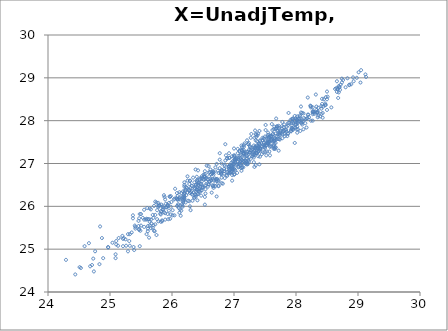
| Category | X=UnadjTemp, Y=LongTemp |
|---|---|
| 24.84 | 25.53 |
| 25.22 | 25.26 |
| 26.04 | 26.18 |
| 26.38 | 26.86 |
| 26.2 | 26.56 |
| 26.53 | 26.82 |
| 26.41 | 26.14 |
| 25.98 | 26.24 |
| 25.78 | 25.65 |
| 25.95 | 25.9 |
| 25.63 | 25.27 |
| 25.5 | 25.55 |
| 25.47 | 25.45 |
| 25.8 | 26.02 |
| 26.75 | 26.48 |
| 27.27 | 27.6 |
| 27.7 | 27.77 |
| 27.46 | 27.6 |
| 27.72 | 27.88 |
| 27.34 | 27.77 |
| 27.49 | 27.42 |
| 27.42 | 27.52 |
| 27.48 | 27.44 |
| 27.13 | 27.3 |
| 26.85 | 26.97 |
| 26.8 | 27 |
| 27.33 | 27.3 |
| 27.88 | 28.18 |
| 27.98 | 27.48 |
| 27.32 | 27.03 |
| 26.72 | 26.63 |
| 26.46 | 26.45 |
| 26.54 | 26.4 |
| 26.53 | 26.7 |
| 26.35 | 26.33 |
| 26.53 | 26.04 |
| 26.85 | 26.94 |
| 27.19 | 27 |
| 27.67 | 27.48 |
| 28.19 | 28.54 |
| 28.28 | 28.21 |
| 28.02 | 28.1 |
| 27.51 | 27.42 |
| 27.15 | 26.91 |
| 27.12 | 27.42 |
| 27.02 | 26.84 |
| 26.97 | 26.96 |
| 27.0 | 26.74 |
| 27.03 | 26.97 |
| 27.22 | 26.98 |
| 27.21 | 27.27 |
| 26.86 | 27.45 |
| 27.06 | 27.34 |
| 26.92 | 26.88 |
| 26.36 | 26.2 |
| 25.73 | 25.8 |
| 25.37 | 25.72 |
| 25.5 | 25.82 |
| 25.66 | 25.49 |
| 25.37 | 25.79 |
| 25.55 | 25.92 |
| 25.91 | 25.98 |
| 26.38 | 26.46 |
| 26.67 | 26.82 |
| 26.66 | 26.64 |
| 26.55 | 26.49 |
| 26.3 | 25.91 |
| 25.6 | 25.96 |
| 25.61 | 25.42 |
| 24.66 | 25.14 |
| 24.29 | 24.75 |
| 24.59 | 25.07 |
| 25.29 | 25.35 |
| 26.01 | 25.79 |
| 26.64 | 26.32 |
| 26.98 | 26.99 |
| 27.23 | 27.28 |
| 26.98 | 26.85 |
| 26.37 | 26.28 |
| 25.9 | 26.06 |
| 25.89 | 25.84 |
| 25.83 | 26.04 |
| 25.64 | 25.64 |
| 25.71 | 26.01 |
| 26.1 | 26.02 |
| 26.59 | 26.52 |
| 27.64 | 27.34 |
| 28.34 | 28.19 |
| 28.57 | 28.31 |
| 28.27 | 28.22 |
| 28.1 | 27.91 |
| 27.74 | 27.66 |
| 27.53 | 27.28 |
| 27.48 | 27.48 |
| 27.79 | 27.74 |
| 28.07 | 27.76 |
| 28.36 | 28.12 |
| 28.41 | 28.16 |
| 28.33 | 28.25 |
| 28.35 | 28.08 |
| 28.34 | 28.19 |
| 28.04 | 27.99 |
| 27.47 | 27.26 |
| 26.89 | 27.12 |
| 26.49 | 26.44 |
| 26.6 | 26.7 |
| 26.89 | 26.71 |
| 26.77 | 26.89 |
| 27.13 | 27.01 |
| 27.25 | 27.26 |
| 27.55 | 27.52 |
| 27.93 | 28.04 |
| 27.8 | 27.85 |
| 27.34 | 27.36 |
| 26.56 | 26.95 |
| 26.32 | 26.47 |
| 26.17 | 26.22 |
| 26.42 | 26.84 |
| 26.32 | 26.48 |
| 26.43 | 26.54 |
| 26.25 | 26.6 |
| 26.28 | 26.52 |
| 26.97 | 27.17 |
| 27.51 | 27.78 |
| 27.61 | 27.92 |
| 27.24 | 27.48 |
| 27.06 | 26.98 |
| 26.84 | 26.87 |
| 26.59 | 26.79 |
| 26.34 | 26.67 |
| 26.33 | 26.27 |
| 26.4 | 26.6 |
| 26.37 | 26.43 |
| 26.61 | 26.8 |
| 27.0 | 27.16 |
| 27.51 | 27.9 |
| 27.85 | 27.86 |
| 27.84 | 27.79 |
| 27.13 | 26.9 |
| 26.41 | 26.62 |
| 25.96 | 26.23 |
| 25.93 | 26.02 |
| 26.2 | 26.46 |
| 26.2 | 26.3 |
| 26.12 | 26.33 |
| 26.29 | 26.6 |
| 26.8 | 26.85 |
| 27.23 | 27.45 |
| 27.23 | 27.45 |
| 27.17 | 27.47 |
| 26.92 | 26.92 |
| 26.51 | 26.74 |
| 26.07 | 26.19 |
| 26.05 | 26.41 |
| 25.88 | 26.22 |
| 25.75 | 26.09 |
| 25.87 | 26.26 |
| 26.39 | 26.5 |
| 27.31 | 27.2 |
| 27.87 | 27.71 |
| 27.7 | 27.86 |
| 27.68 | 27.81 |
| 27.89 | 27.95 |
| 27.62 | 27.78 |
| 27.45 | 27.4 |
| 27.55 | 27.57 |
| 27.6 | 27.4 |
| 27.7 | 27.63 |
| 27.42 | 27.33 |
| 27.27 | 27.31 |
| 27.11 | 27.1 |
| 27.06 | 27.24 |
| 26.93 | 27.13 |
| 26.65 | 26.81 |
| 26.41 | 26.58 |
| 25.73 | 26.11 |
| 25.48 | 25.82 |
| 25.53 | 25.73 |
| 25.4 | 25.55 |
| 25.41 | 25.52 |
| 25.78 | 26.01 |
| 26.37 | 26.41 |
| 27.13 | 26.92 |
| 27.62 | 27.68 |
| 28.07 | 28.05 |
| 28.19 | 28.14 |
| 28.01 | 28.03 |
| 28.06 | 28.12 |
| 28.02 | 28.01 |
| 28.24 | 28.34 |
| 28.28 | 28.2 |
| 28.05 | 28.04 |
| 27.74 | 27.71 |
| 27.66 | 27.59 |
| 28.21 | 28.08 |
| 28.24 | 28.31 |
| 27.67 | 27.81 |
| 27.77 | 27.82 |
| 27.41 | 27.45 |
| 26.65 | 26.77 |
| 26.48 | 26.7 |
| 26.4 | 26.69 |
| 26.41 | 26.28 |
| 26.2 | 26.32 |
| 26.17 | 26.02 |
| 26.36 | 26.2 |
| 26.67 | 26.79 |
| 26.92 | 27.24 |
| 27.5 | 27.63 |
| 27.61 | 27.56 |
| 27.16 | 27.12 |
| 26.6 | 26.57 |
| 26.09 | 26.17 |
| 26.18 | 26.35 |
| 26.25 | 26.32 |
| 26.09 | 26.24 |
| 25.78 | 25.98 |
| 25.79 | 26.02 |
| 26.38 | 26.5 |
| 27.09 | 27.3 |
| 27.16 | 27.43 |
| 27.69 | 27.87 |
| 27.6 | 27.54 |
| 27.11 | 27.2 |
| 26.89 | 26.8 |
| 26.98 | 27.05 |
| 27.37 | 27.42 |
| 27.42 | 27.35 |
| 27.55 | 27.48 |
| 27.95 | 27.79 |
| 28.02 | 27.86 |
| 28.39 | 28.1 |
| 28.5 | 28.25 |
| 28.0 | 27.95 |
| 27.3 | 27.32 |
| 27.16 | 27.39 |
| 27.33 | 27.22 |
| 27.5 | 27.39 |
| 27.35 | 27.4 |
| 27.31 | 27.27 |
| 27.07 | 27.13 |
| 27.04 | 27.12 |
| 27.37 | 27.52 |
| 27.96 | 27.95 |
| 27.77 | 27.87 |
| 27.13 | 27.38 |
| 26.47 | 26.25 |
| 25.86 | 25.92 |
| 25.86 | 25.97 |
| 25.78 | 26.08 |
| 25.82 | 25.81 |
| 25.47 | 25.47 |
| 25.1 | 25.11 |
| 25.41 | 25.48 |
| 26.11 | 25.96 |
| 26.79 | 26.8 |
| 27.06 | 27.04 |
| 26.7 | 26.91 |
| 26.29 | 26.59 |
| 25.97 | 26.22 |
| 25.93 | 26 |
| 25.64 | 25.95 |
| 25.69 | 25.8 |
| 25.55 | 25.69 |
| 25.85 | 26 |
| 26.43 | 26.55 |
| 27.22 | 27 |
| 27.94 | 27.98 |
| 28.27 | 28.19 |
| 28.23 | 28.35 |
| 28.18 | 28.06 |
| 28.1 | 28.18 |
| 28.09 | 27.94 |
| 28.45 | 28.5 |
| 28.68 | 28.53 |
| 28.8 | 28.78 |
| 28.43 | 28.18 |
| 27.99 | 27.84 |
| 27.72 | 27.83 |
| 27.39 | 27.7 |
| 27.13 | 27.3 |
| 26.74 | 26.83 |
| 25.95 | 26.08 |
| 25.46 | 25.66 |
| 25.32 | 25.35 |
| 25.04 | 25.15 |
| 24.51 | 24.58 |
| 24.44 | 24.41 |
| 24.53 | 24.56 |
| 25.14 | 25.26 |
| 25.93 | 25.82 |
| 26.65 | 26.77 |
| 26.86 | 27.07 |
| 26.72 | 26.99 |
| 26.48 | 26.58 |
| 26.36 | 26.56 |
| 26.22 | 26.4 |
| 25.91 | 25.98 |
| 25.63 | 25.7 |
| 25.7 | 25.73 |
| 26.19 | 26.21 |
| 26.24 | 26.43 |
| 26.46 | 26.66 |
| 27.01 | 27.18 |
| 26.97 | 26.87 |
| 26.3 | 26.43 |
| 25.98 | 25.99 |
| 25.47 | 25.72 |
| 25.2 | 25.31 |
| 24.87 | 25.26 |
| 25.1 | 25.19 |
| 24.76 | 24.95 |
| 24.73 | 24.78 |
| 25.59 | 25.71 |
| 26.61 | 26.58 |
| 27.0 | 27.35 |
| 27.28 | 27.37 |
| 27.35 | 27.69 |
| 27.26 | 27.38 |
| 27.09 | 27.18 |
| 27.12 | 27.32 |
| 27.48 | 27.59 |
| 27.42 | 27.54 |
| 27.16 | 27.23 |
| 27.32 | 27.42 |
| 27.16 | 27.31 |
| 27.58 | 27.65 |
| 27.61 | 27.52 |
| 27.96 | 27.84 |
| 27.95 | 28.05 |
| 27.55 | 27.67 |
| 26.92 | 27.13 |
| 27.2 | 27.19 |
| 27.36 | 27.62 |
| 27.28 | 27.69 |
| 27.36 | 27.67 |
| 27.32 | 27.3 |
| 27.17 | 27.27 |
| 27.24 | 27.32 |
| 27.26 | 27.4 |
| 27.35 | 27.37 |
| 27.16 | 27.23 |
| 26.8 | 26.75 |
| 26.23 | 26.26 |
| 26.2 | 26.15 |
| 26.4 | 26.39 |
| 26.43 | 26.5 |
| 26.49 | 26.66 |
| 26.45 | 26.63 |
| 26.62 | 26.86 |
| 27.48 | 27.38 |
| 27.87 | 27.94 |
| 27.75 | 27.77 |
| 27.55 | 27.72 |
| 26.96 | 27.02 |
| 26.77 | 27.09 |
| 27.15 | 27.23 |
| 27.01 | 27.05 |
| 27.08 | 27 |
| 27.09 | 27.28 |
| 27.1 | 27.13 |
| 27.03 | 27.09 |
| 27.38 | 27.35 |
| 27.78 | 27.97 |
| 27.98 | 28 |
| 27.99 | 28.05 |
| 27.35 | 27.25 |
| 26.62 | 26.65 |
| 26.57 | 26.63 |
| 26.51 | 26.63 |
| 26.63 | 26.75 |
| 26.59 | 26.94 |
| 26.18 | 26.12 |
| 26.15 | 26.31 |
| 26.77 | 27.24 |
| 27.33 | 27.6 |
| 27.41 | 27.76 |
| 27.35 | 27.54 |
| 26.67 | 26.79 |
| 26.25 | 26.7 |
| 26.53 | 26.68 |
| 26.52 | 26.7 |
| 26.41 | 26.39 |
| 26.48 | 26.65 |
| 26.7 | 26.54 |
| 26.73 | 26.64 |
| 27.36 | 27.24 |
| 27.91 | 28.01 |
| 28.42 | 28.51 |
| 28.32 | 28.61 |
| 27.65 | 27.86 |
| 27.64 | 27.8 |
| 28.2 | 28.14 |
| 28.67 | 28.73 |
| 28.71 | 28.72 |
| 28.93 | 28.92 |
| 28.92 | 29.01 |
| 28.74 | 28.98 |
| 28.76 | 28.95 |
| 28.74 | 28.89 |
| 28.83 | 28.99 |
| 28.27 | 28.31 |
| 27.19 | 27.11 |
| 26.53 | 26.75 |
| 26.19 | 26.26 |
| 25.76 | 25.7 |
| 25.55 | 25.52 |
| 25.82 | 25.64 |
| 26.14 | 25.78 |
| 26.72 | 26.23 |
| 27.05 | 26.78 |
| 27.3 | 27.17 |
| 27.3 | 27.22 |
| 26.95 | 26.79 |
| 26.84 | 26.82 |
| 26.66 | 26.47 |
| 26.43 | 26.4 |
| 26.15 | 25.9 |
| 25.61 | 25.48 |
| 25.38 | 25.05 |
| 25.58 | 25.69 |
| 26.12 | 25.85 |
| 26.54 | 26.3 |
| 26.93 | 26.79 |
| 27.09 | 26.97 |
| 26.92 | 26.93 |
| 26.63 | 26.62 |
| 26.27 | 26.38 |
| 26.08 | 26.18 |
| 26.22 | 26.09 |
| 26.38 | 26.22 |
| 26.19 | 26.19 |
| 26.04 | 25.79 |
| 26.28 | 26.12 |
| 27.01 | 26.75 |
| 27.65 | 27.36 |
| 27.58 | 27.39 |
| 27.56 | 27.61 |
| 27.38 | 27.38 |
| 27.21 | 27.11 |
| 27.35 | 27.34 |
| 27.59 | 27.63 |
| 27.67 | 27.7 |
| 27.74 | 27.56 |
| 27.81 | 27.77 |
| 28.03 | 27.94 |
| 28.5 | 28.5 |
| 28.69 | 28.66 |
| 28.7 | 28.77 |
| 28.66 | 28.92 |
| 28.51 | 28.56 |
| 28.47 | 28.36 |
| 28.41 | 28.28 |
| 28.07 | 28.1 |
| 27.93 | 27.94 |
| 27.6 | 27.64 |
| 27.5 | 27.27 |
| 27.02 | 27.11 |
| 27.46 | 27.54 |
| 27.57 | 27.28 |
| 26.97 | 26.82 |
| 26.2 | 26.23 |
| 25.66 | 25.69 |
| 25.71 | 25.43 |
| 25.72 | 25.42 |
| 24.83 | 24.65 |
| 24.74 | 24.48 |
| 24.68 | 24.6 |
| 24.71 | 24.63 |
| 25.35 | 25.39 |
| 26.13 | 25.93 |
| 26.85 | 26.66 |
| 27.19 | 27.06 |
| 27.24 | 27.04 |
| 26.79 | 26.76 |
| 26.42 | 26.29 |
| 26.46 | 26.37 |
| 26.31 | 26.33 |
| 26.28 | 26.36 |
| 26.58 | 26.46 |
| 26.63 | 26.6 |
| 27.04 | 27.12 |
| 27.41 | 27.46 |
| 27.95 | 28.03 |
| 28.08 | 28.19 |
| 27.63 | 27.69 |
| 27.42 | 27.37 |
| 27.16 | 27.05 |
| 26.96 | 26.87 |
| 27.01 | 26.86 |
| 26.88 | 26.73 |
| 26.97 | 26.9 |
| 27.08 | 27.09 |
| 27.13 | 27.08 |
| 27.39 | 27.36 |
| 28.11 | 27.98 |
| 28.36 | 28.3 |
| 28.41 | 28.34 |
| 28.17 | 27.84 |
| 27.72 | 27.3 |
| 27.41 | 26.98 |
| 27.61 | 27.64 |
| 27.92 | 27.79 |
| 28.3 | 28.2 |
| 28.35 | 28.19 |
| 28.42 | 28.39 |
| 28.65 | 28.76 |
| 29.05 | 29.18 |
| 29.01 | 29.13 |
| 28.35 | 28.22 |
| 27.56 | 27.5 |
| 26.97 | 26.73 |
| 26.67 | 26.61 |
| 26.4 | 26.39 |
| 26.59 | 26.51 |
| 26.71 | 26.63 |
| 26.88 | 26.86 |
| 27.21 | 27.18 |
| 27.72 | 27.73 |
| 28.5 | 28.68 |
| 28.7 | 28.79 |
| 28.08 | 28.33 |
| 27.6 | 27.55 |
| 27.02 | 27.04 |
| 27.14 | 27.01 |
| 27.01 | 27.09 |
| 26.92 | 26.94 |
| 26.79 | 26.77 |
| 26.75 | 26.61 |
| 26.97 | 26.6 |
| 27.52 | 27.19 |
| 28.12 | 27.8 |
| 28.27 | 28 |
| 28.09 | 27.96 |
| 27.67 | 27.38 |
| 27.39 | 27.4 |
| 27.25 | 27.15 |
| 27.54 | 27.63 |
| 27.95 | 27.79 |
| 28.01 | 27.8 |
| 27.74 | 27.68 |
| 27.68 | 27.64 |
| 27.92 | 27.75 |
| 28.17 | 28.04 |
| 27.87 | 27.89 |
| 27.8 | 27.77 |
| 27.25 | 27.26 |
| 26.42 | 26.5 |
| 26.2 | 26.18 |
| 26.08 | 26.01 |
| 25.83 | 25.87 |
| 25.87 | 25.86 |
| 25.85 | 25.93 |
| 25.99 | 26.1 |
| 26.75 | 26.78 |
| 27.42 | 27.43 |
| 27.65 | 27.46 |
| 27.49 | 27.57 |
| 27.01 | 27.08 |
| 26.75 | 26.58 |
| 26.44 | 26.41 |
| 26.49 | 26.46 |
| 26.43 | 26.35 |
| 26.13 | 26.16 |
| 26.09 | 26.15 |
| 26.47 | 26.53 |
| 27.15 | 27.19 |
| 27.98 | 28.11 |
| 28.63 | 28.74 |
| 28.86 | 28.84 |
| 28.86 | 28.83 |
| 28.69 | 28.81 |
| 28.89 | 28.85 |
| 29.13 | 29.02 |
| 29.12 | 29.08 |
| 29.04 | 28.89 |
| 28.98 | 29 |
| 28.72 | 28.84 |
| 28.67 | 28.75 |
| 28.66 | 28.67 |
| 28.48 | 28.55 |
| 27.42 | 27.3 |
| 26.53 | 26.49 |
| 25.93 | 26.04 |
| 25.66 | 25.93 |
| 25.46 | 25.54 |
| 25.49 | 25.43 |
| 25.13 | 25.08 |
| 24.97 | 25.05 |
| 25.59 | 25.35 |
| 26.45 | 26.34 |
| 26.93 | 26.96 |
| 27.0 | 26.99 |
| 26.67 | 26.74 |
| 26.28 | 26.39 |
| 25.82 | 25.89 |
| 25.76 | 25.91 |
| 25.61 | 25.7 |
| 25.21 | 25.24 |
| 24.97 | 25.04 |
| 24.89 | 24.79 |
| 25.25 | 25.23 |
| 26.29 | 26 |
| 27.0 | 26.97 |
| 27.11 | 27.07 |
| 26.97 | 26.93 |
| 26.69 | 26.65 |
| 26.46 | 26.52 |
| 26.32 | 26.36 |
| 26.12 | 26.18 |
| 26.01 | 25.91 |
| 25.84 | 25.67 |
| 25.94 | 25.7 |
| 26.26 | 26.13 |
| 26.91 | 26.78 |
| 27.4 | 27.47 |
| 27.71 | 27.57 |
| 27.61 | 27.58 |
| 27.37 | 27.24 |
| 26.96 | 26.8 |
| 26.75 | 26.47 |
| 26.67 | 26.47 |
| 26.48 | 26.37 |
| 26.33 | 26.13 |
| 26.5 | 26.44 |
| 26.84 | 26.76 |
| 27.5 | 27.36 |
| 28.0 | 27.91 |
| 28.43 | 28.07 |
| 28.48 | 28.37 |
| 28.03 | 27.8 |
| 27.65 | 27.57 |
| 27.73 | 27.57 |
| 27.93 | 27.89 |
| 28.13 | 28.06 |
| 28.09 | 28 |
| 27.68 | 27.56 |
| 27.64 | 27.4 |
| 27.85 | 27.74 |
| 27.75 | 27.74 |
| 27.43 | 27.34 |
| 27.57 | 27.5 |
| 27.67 | 27.37 |
| 27.33 | 26.92 |
| 27.11 | 26.9 |
| 27.33 | 27.19 |
| 27.14 | 27.05 |
| 27.07 | 26.91 |
| 26.93 | 26.84 |
| 27.07 | 26.93 |
| 27.42 | 27.16 |
| 27.93 | 27.83 |
| 28.03 | 27.96 |
| 27.94 | 27.82 |
| 27.86 | 27.64 |
| 27.66 | 27.54 |
| 27.58 | 27.42 |
| 27.55 | 27.46 |
| 27.39 | 27.27 |
| 27.4 | 27.3 |
| 27.32 | 27.14 |
| 27.18 | 27.02 |
| 27.64 | 27.54 |
| 28.03 | 28.05 |
| 28.3 | 28.16 |
| 27.99 | 27.91 |
| 27.45 | 27.22 |
| 27.12 | 26.83 |
| 26.8 | 26.67 |
| 26.72 | 26.59 |
| 26.13 | 26.21 |
| 25.81 | 25.83 |
| 25.67 | 25.6 |
| 26.16 | 26.05 |
| 26.82 | 26.53 |
| 27.55 | 27.47 |
| 27.92 | 27.76 |
| 27.83 | 27.78 |
| 27.37 | 27.25 |
| 27.26 | 27.25 |
| 27.33 | 27.38 |
| 27.48 | 27.49 |
| 27.82 | 27.64 |
| 27.87 | 27.69 |
| 27.39 | 27.17 |
| 27.0 | 26.88 |
| 27.27 | 27.11 |
| 27.56 | 27.61 |
| 27.55 | 27.47 |
| 27.54 | 27.52 |
| 26.94 | 26.86 |
| 26.29 | 26.31 |
| 25.97 | 25.71 |
| 25.75 | 25.33 |
| 25.48 | 25.07 |
| 25.39 | 24.98 |
| 25.09 | 24.79 |
| 25.21 | 25.07 |
| 26.18 | 26.09 |
| 26.98 | 26.88 |
| 27.2 | 27.22 |
| 27.15 | 27.24 |
| 27.0 | 27.19 |
| 26.81 | 26.83 |
| 26.7 | 26.47 |
| 26.67 | 26.43 |
| 26.32 | 26.29 |
| 25.89 | 25.69 |
| 25.73 | 25.58 |
| 26.1 | 26.05 |
| 26.8 | 26.54 |
| 27.65 | 27.52 |
| 28.15 | 28.04 |
| 28.12 | 28.17 |
| 27.81 | 27.91 |
| 27.53 | 27.49 |
| 27.53 | 27.43 |
| 27.78 | 27.69 |
| 28.27 | 28.15 |
| 28.47 | 28.4 |
| 28.24 | 28 |
| 28.15 | 27.94 |
| 28.33 | 28.33 |
| 28.44 | 28.33 |
| 28.02 | 27.72 |
| 27.23 | 27.07 |
| 26.39 | 26.34 |
| 25.64 | 25.55 |
| 25.31 | 25.19 |
| 25.26 | 25.08 |
| 25.32 | 25.08 |
| 25.29 | 24.95 |
| 25.09 | 24.88 |
| 25.69 | 25.5 |
| 26.39 | 26.27 |
| 27.21 | 27.03 |
| 27.66 | 27.34 |
| 27.64 | 27.43 |
| 27.09 | 27 |
| 26.53 | 26.22 |
| 26.17 | 25.99 |
| 25.98 | 25.81 |
| 25.7 | 25.56 |
| 25.61 | 25.54 |
| 25.84 | 25.65 |
| 26.18 | 26.15 |
| 26.93 | 26.78 |
| 27.54 | 27.48 |
| 27.72 | 27.69 |
| 27.69 | 27.82 |
| 27.38 | 27.66 |
| 27.21 | 27.54 |
| 27.58 | 27.19 |
| 27.35 | 26.96 |
| 27.2 | 26.98 |
| 26.23 | 26.45 |
| 25.89 | 26.16 |
| 26.21 | 26.36 |
| 26.89 | 27.12 |
| 27.81 | 27.69 |
| 27.78 | 27.59 |
| 27.38 | 27.36 |
| 26.95 | 26.94 |
| 26.55 | 26.59 |
| 26.55 | 26.66 |
| 26.65 | 26.49 |
| 26.54 | 26.64 |
| 26.2 | 26.5 |
| 26.03 | 26.16 |
| 26.08 | 26.31 |
| 26.87 | 27.19 |
| 27.68 | 28.05 |